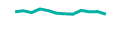
| Category | Series 1 | Series 0 |
|---|---|---|
| 0 | 76 | 76 |
| 1 | 81 | 81 |
| 2 | 72 | 72 |
| 3 | 90 | 90 |
| 4 | 82 | 82 |
| 5 | 69 | 69 |
| 6 | 66 | 66 |
| 7 | 64 | 64 |
| 8 | 83 | 83 |
| 9 | 76 | 76 |
| 10 | 77 | 77 |
| 11 | 64 | 64 |